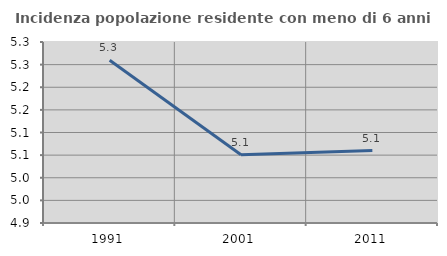
| Category | Incidenza popolazione residente con meno di 6 anni |
|---|---|
| 1991.0 | 5.26 |
| 2001.0 | 5.051 |
| 2011.0 | 5.06 |